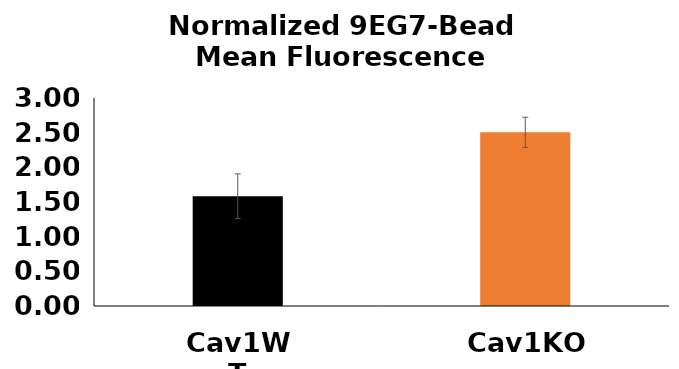
| Category | Series 0 |
|---|---|
| Cav1WT | 1.582 |
| Cav1KO | 2.506 |